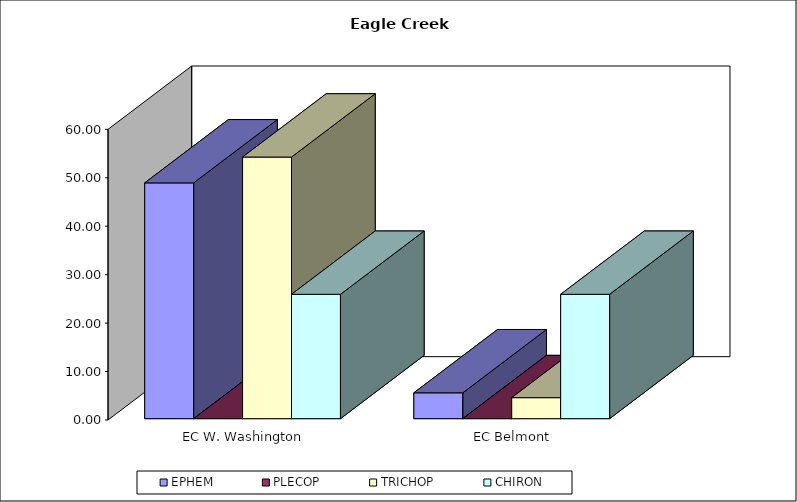
| Category | EPHEM | PLECOP | TRICHOP | CHIRON |
|---|---|---|---|---|
| EC W. Washington | 48.667 | 0 | 54 | 25.667 |
| EC Belmont | 5.333 | 0 | 4.333 | 25.667 |